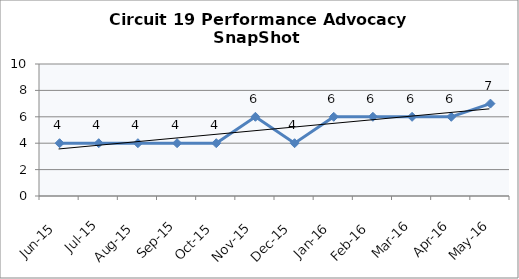
| Category | Circuit 19 |
|---|---|
| Jun-15 | 4 |
| Jul-15 | 4 |
| Aug-15 | 4 |
| Sep-15 | 4 |
| Oct-15 | 4 |
| Nov-15 | 6 |
| Dec-15 | 4 |
| Jan-16 | 6 |
| Feb-16 | 6 |
| Mar-16 | 6 |
| Apr-16 | 6 |
| May-16 | 7 |